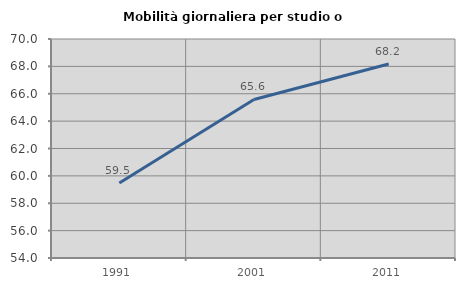
| Category | Mobilità giornaliera per studio o lavoro |
|---|---|
| 1991.0 | 59.481 |
| 2001.0 | 65.582 |
| 2011.0 | 68.172 |